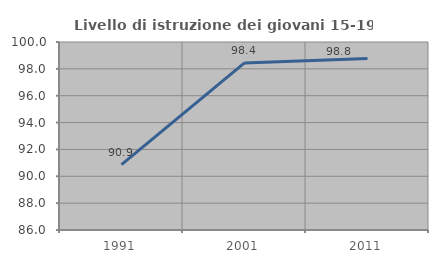
| Category | Livello di istruzione dei giovani 15-19 anni |
|---|---|
| 1991.0 | 90.862 |
| 2001.0 | 98.444 |
| 2011.0 | 98.771 |